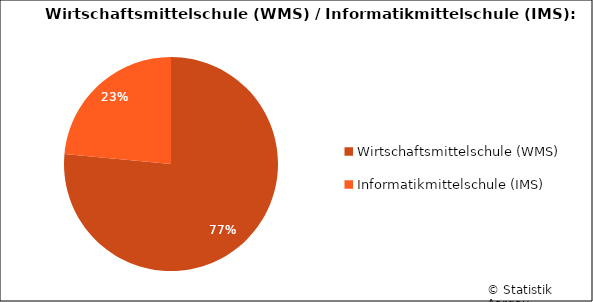
| Category | Series 0 |
|---|---|
| Wirtschaftsmittelschule (WMS) | 127 |
| Informatikmittelschule (IMS) | 39 |